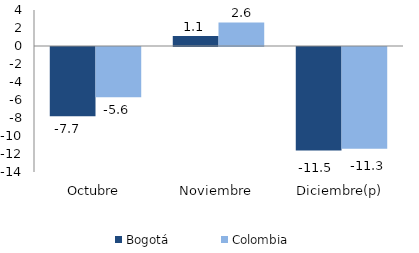
| Category | Bogotá | Colombia |
|---|---|---|
| Octubre | -7.693 | -5.575 |
| Noviembre | 1.11 | 2.623 |
| Diciembre(p) | -11.512 | -11.294 |